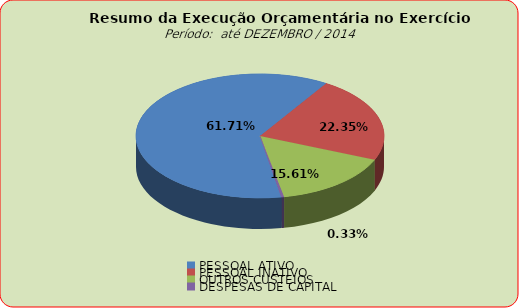
| Category | Series 0 |
|---|---|
| PESSOAL ATIVO | 124077867.94 |
| PESSOAL INATIVO | 44937804.31 |
| OUTROS CUSTEIOS | 31395304.28 |
| DESPESAS DE CAPITAL | 659984.11 |